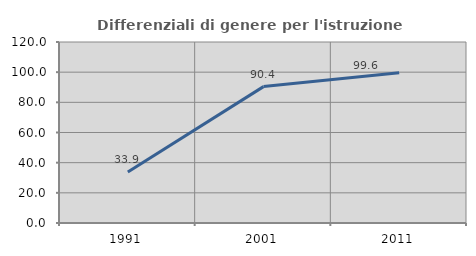
| Category | Differenziali di genere per l'istruzione superiore |
|---|---|
| 1991.0 | 33.871 |
| 2001.0 | 90.426 |
| 2011.0 | 99.556 |